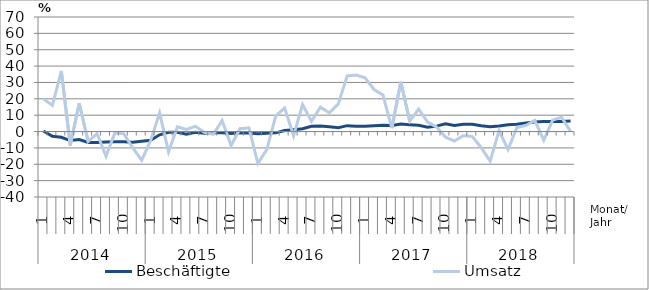
| Category | Beschäftigte | Umsatz |
|---|---|---|
| 0 | 0.3 | 19.9 |
| 1 | -2.9 | 16 |
| 2 | -3.5 | 37 |
| 3 | -5.5 | -8.5 |
| 4 | -4.9 | 17.3 |
| 5 | -6.7 | -6.1 |
| 6 | -6.7 | -1.2 |
| 7 | -6.4 | -15 |
| 8 | -6.2 | -0.8 |
| 9 | -6.2 | -1.4 |
| 10 | -6.6 | -10 |
| 11 | -5.9 | -17.5 |
| 12 | -5.3 | -5.5 |
| 13 | -2 | 11.4 |
| 14 | -0.5 | -12.4 |
| 15 | -0.5 | 2.9 |
| 16 | -1.7 | 1.3 |
| 17 | -0.5 | 3.2 |
| 18 | -1.1 | -0.5 |
| 19 | -0.8 | -1.7 |
| 20 | -0.7 | 6.7 |
| 21 | -1.2 | -8.5 |
| 22 | -0.7 | 1.7 |
| 23 | -0.9 | 2.3 |
| 24 | -1.3 | -19.4 |
| 25 | -1.1 | -11 |
| 26 | -0.8 | 9.4 |
| 27 | 0.6 | 14.4 |
| 28 | 1.1 | -2.6 |
| 29 | 1.7 | 16.5 |
| 30 | 3.2 | 6.3 |
| 31 | 3.4 | 14.9 |
| 32 | 3 | 11.4 |
| 33 | 2.4 | 16.9 |
| 34 | 3.6 | 34 |
| 35 | 3.2 | 34.5 |
| 36 | 3.3 | 32.8 |
| 37 | 3.6 | 25.7 |
| 38 | 3.9 | 22.4 |
| 39 | 3.7 | 2.1 |
| 40 | 4.6 | 30.4 |
| 41 | 4.2 | 6.4 |
| 42 | 3.8 | 13.7 |
| 43 | 2.7 | 5.8 |
| 44 | 3.3 | 2.8 |
| 45 | 4.7 | -3.4 |
| 46 | 3.7 | -5.8 |
| 47 | 4.4 | -2.5 |
| 48 | 4.5 | -3 |
| 49 | 3.6 | -9.8 |
| 50 | 2.9 | -18.1 |
| 51 | 3.4 | 0.5 |
| 52 | 4.2 | -11 |
| 53 | 4.5 | 2.5 |
| 54 | 5.3 | 3.7 |
| 55 | 5.8 | 6.8 |
| 56 | 6.1 | -5.3 |
| 57 | 6.2 | 7 |
| 58 | 6.2 | 8.7 |
| 59 | 6.4 | 0.1 |